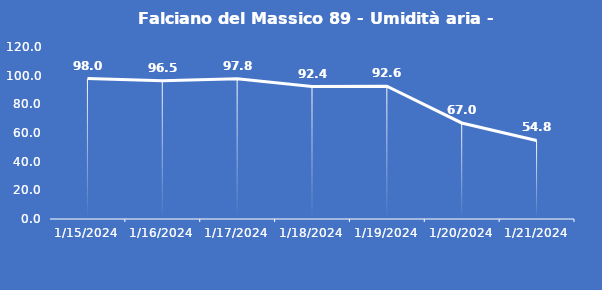
| Category | Falciano del Massico 89 - Umidità aria - Grezzo (%) |
|---|---|
| 1/15/24 | 98 |
| 1/16/24 | 96.5 |
| 1/17/24 | 97.8 |
| 1/18/24 | 92.4 |
| 1/19/24 | 92.6 |
| 1/20/24 | 67 |
| 1/21/24 | 54.8 |